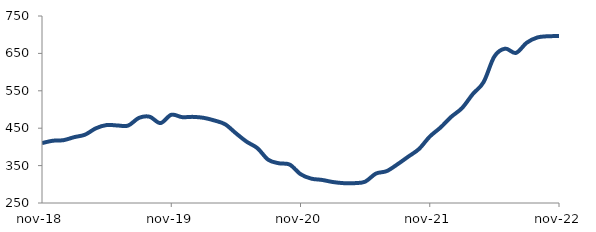
| Category | Series 0 |
|---|---|
| 2018-11-01 | 410.128 |
| 2018-12-01 | 416.457 |
| 2019-01-01 | 418.023 |
| 2019-02-01 | 426.141 |
| 2019-03-01 | 432.718 |
| 2019-04-01 | 449.714 |
| 2019-05-01 | 458.458 |
| 2019-06-01 | 457.312 |
| 2019-07-01 | 457.058 |
| 2019-08-01 | 477.544 |
| 2019-09-01 | 480.652 |
| 2019-10-01 | 463.67 |
| 2019-11-01 | 485.887 |
| 2019-12-01 | 479.593 |
| 2020-01-01 | 480.293 |
| 2020-02-01 | 477.774 |
| 2020-03-01 | 470.708 |
| 2020-04-01 | 460.537 |
| 2020-05-01 | 436.562 |
| 2020-06-01 | 413.857 |
| 2020-07-01 | 396.652 |
| 2020-08-01 | 365.687 |
| 2020-09-01 | 356.18 |
| 2020-10-01 | 352.658 |
| 2020-11-01 | 327.164 |
| 2020-12-01 | 315.173 |
| 2021-01-01 | 311.708 |
| 2021-02-01 | 306.103 |
| 2021-03-01 | 303.075 |
| 2021-04-01 | 303.034 |
| 2021-05-01 | 306.996 |
| 2021-06-01 | 328.614 |
| 2021-07-01 | 335.232 |
| 2021-08-01 | 353.414 |
| 2021-09-01 | 373.869 |
| 2021-10-01 | 394.393 |
| 2021-11-01 | 427.592 |
| 2021-12-01 | 451.83 |
| 2022-01-01 | 480.528 |
| 2022-02-01 | 503.882 |
| 2022-03-01 | 541.428 |
| 2022-04-01 | 573.261 |
| 2022-05-01 | 641.774 |
| 2022-06-01 | 662.728 |
| 2022-07-01 | 651.267 |
| 2022-08-01 | 678.506 |
| 2022-09-01 | 692.688 |
| 2022-10-01 | 695.873 |
| 2022-11-01 | 696.235 |